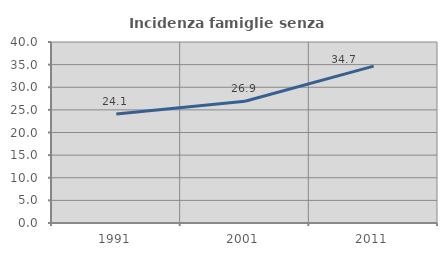
| Category | Incidenza famiglie senza nuclei |
|---|---|
| 1991.0 | 24.069 |
| 2001.0 | 26.914 |
| 2011.0 | 34.661 |